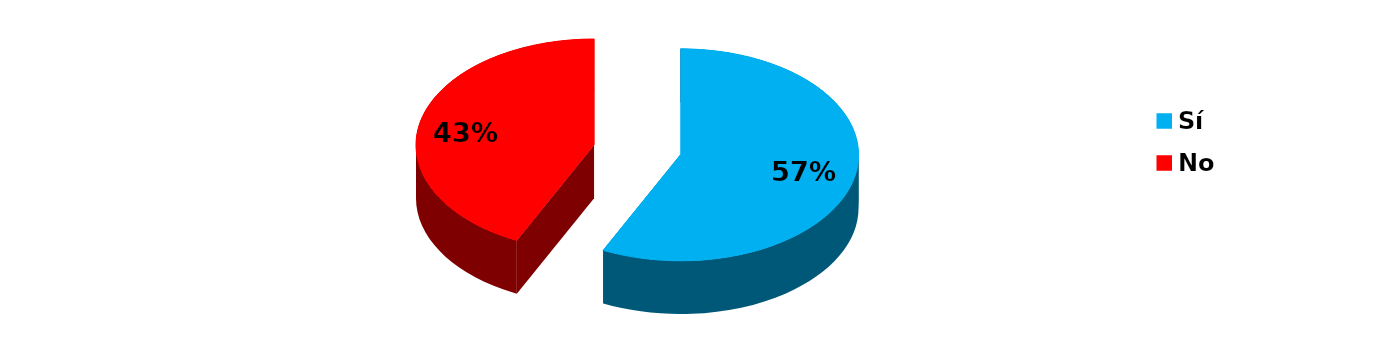
| Category | Series 0 |
|---|---|
| Sí | 4 |
| No | 3 |